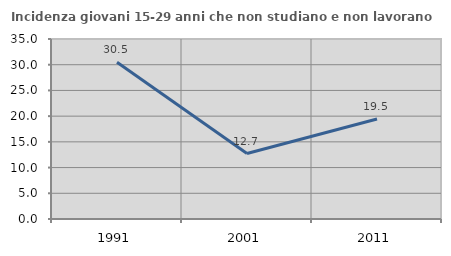
| Category | Incidenza giovani 15-29 anni che non studiano e non lavorano  |
|---|---|
| 1991.0 | 30.469 |
| 2001.0 | 12.724 |
| 2011.0 | 19.455 |